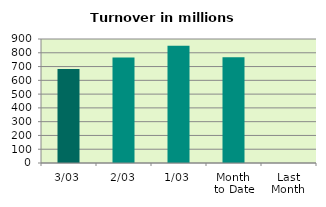
| Category | Series 0 |
|---|---|
| 3/03 | 682.943 |
| 2/03 | 765.784 |
| 1/03 | 851.878 |
| Month 
to Date | 766.868 |
| Last
Month | 0 |